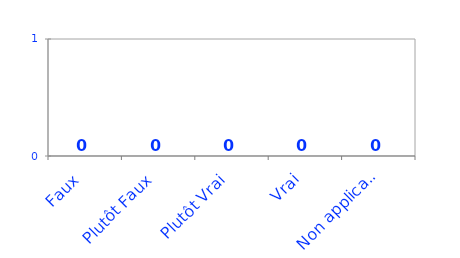
| Category | Series 0 |
|---|---|
| Faux | 0 |
| Plutôt Faux | 0 |
| Plutôt Vrai | 0 |
| Vrai | 0 |
| Non applicable | 0 |